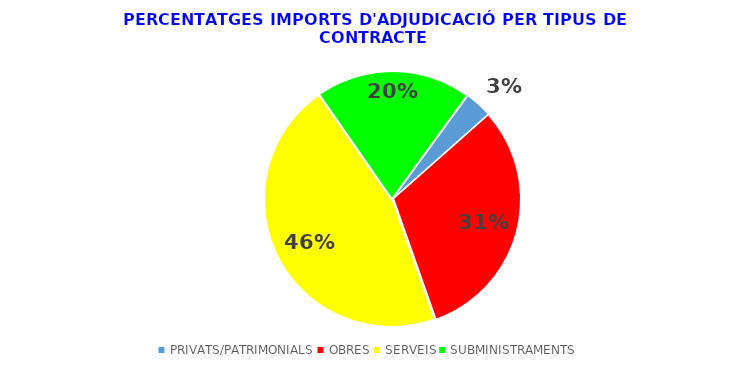
| Category | Series 0 |
|---|---|
| PRIVATS/PATRIMONIALS | 0.035 |
| OBRES | 0.311 |
| SERVEIS | 0.457 |
| SUBMINISTRAMENTS | 0.196 |